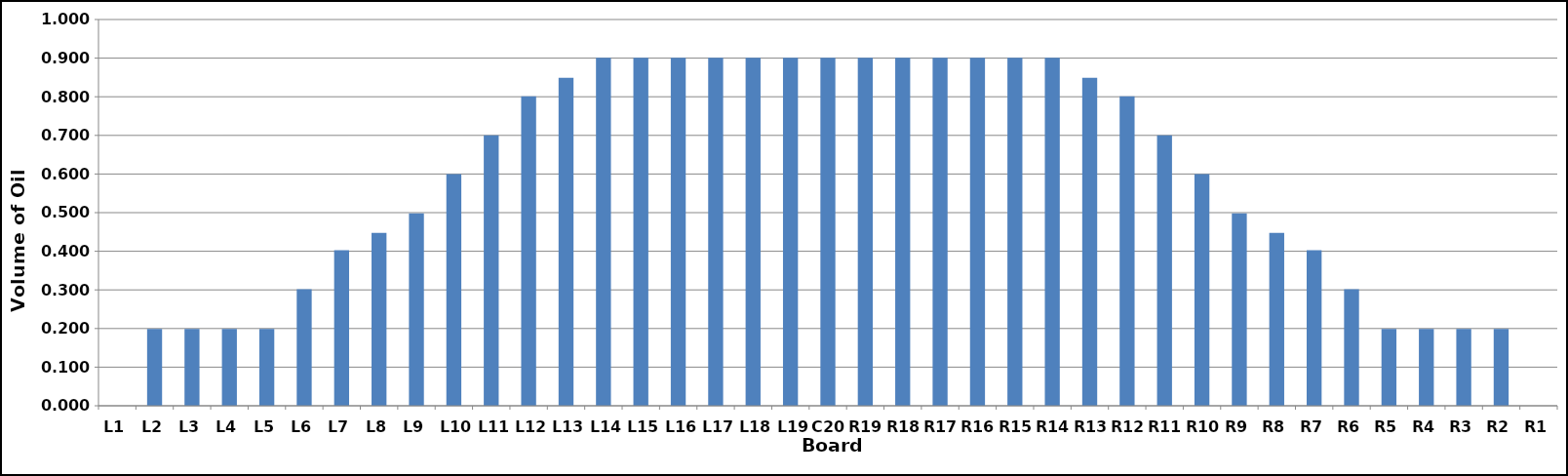
| Category | Series 0 |
|---|---|
| L1 | 0 |
| L2 | 0.199 |
| L3 | 0.199 |
| L4 | 0.199 |
| L5 | 0.199 |
| L6 | 0.302 |
| L7 | 0.403 |
| L8 | 0.448 |
| L9 | 0.498 |
| L10 | 0.6 |
| L11 | 0.7 |
| L12 | 0.801 |
| L13 | 0.849 |
| L14 | 0.901 |
| L15 | 0.901 |
| L16 | 0.901 |
| L17 | 0.901 |
| L18 | 0.901 |
| L19 | 0.901 |
| C20 | 0.901 |
| R19 | 0.901 |
| R18 | 0.901 |
| R17 | 0.901 |
| R16 | 0.901 |
| R15 | 0.901 |
| R14 | 0.901 |
| R13 | 0.849 |
| R12 | 0.801 |
| R11 | 0.7 |
| R10 | 0.6 |
| R9 | 0.498 |
| R8 | 0.448 |
| R7 | 0.403 |
| R6 | 0.302 |
| R5 | 0.199 |
| R4 | 0.199 |
| R3 | 0.199 |
| R2 | 0.199 |
| R1 | 0 |